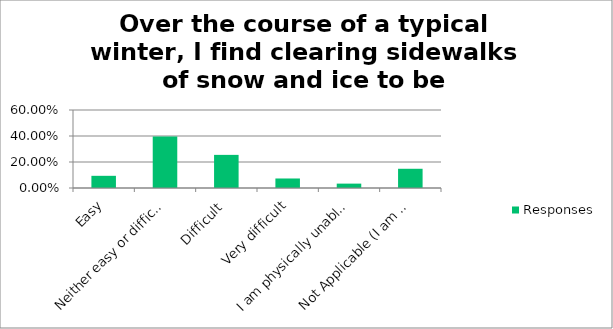
| Category | Responses |
|---|---|
| Easy | 0.094 |
| Neither easy or difficult | 0.397 |
| Difficult | 0.255 |
| Very difficult | 0.073 |
| I am physically unable to shovel snow | 0.034 |
| Not Applicable (I am not responsible for snow and ice removal) | 0.148 |